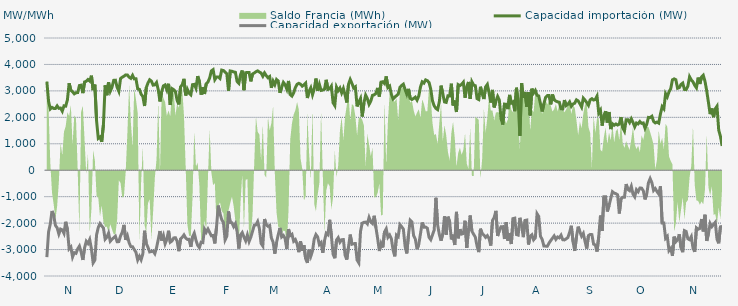
| Category | Capacidad importación (MW) | Capacidad exportación (MW) |
|---|---|---|
| 0 | 3353.167 | -3283.208 |
| 1900-01-01 | 2604.75 | -2336.125 |
| 1900-01-02 | 2316.667 | -2037.25 |
| 1900-01-03 | 2377.083 | -1541.667 |
| 1900-01-04 | 2335.417 | -1708.333 |
| 1900-01-05 | 2333.083 | -2087.5 |
| 1900-01-06 | 2432.958 | -2175.833 |
| 1900-01-07 | 2341.417 | -2411.458 |
| 1900-01-08 | 2350 | -2224.167 |
| 1900-01-09 | 2233.333 | -2255.875 |
| 1900-01-10 | 2436.333 | -2388.333 |
| 1900-01-11 | 2422.917 | -1949.75 |
| 1900-01-12 | 2664.167 | -2243.25 |
| 1900-01-13 | 3289.125 | -2974.875 |
| 1900-01-14 | 3022.042 | -2905.375 |
| 1900-01-15 | 2967.917 | -3281.292 |
| 1900-01-16 | 2888.083 | -3117.75 |
| 1900-01-17 | 2932.458 | -3142.792 |
| 1900-01-18 | 2934.917 | -2973.208 |
| 1900-01-19 | 3202.583 | -2869.458 |
| 1900-01-20 | 3215.75 | -3094.417 |
| 1900-01-21 | 2915.5 | -3393.375 |
| 1900-01-22 | 3338.625 | -2938.583 |
| 1900-01-23 | 3362.542 | -2687.333 |
| 1900-01-24 | 3428.958 | -2770.5 |
| 1900-01-25 | 3372 | -2622.5 |
| 1900-01-26 | 3574.375 | -2972.542 |
| 1900-01-27 | 3028.917 | -3504.875 |
| 1900-01-28 | 3239.167 | -3400.917 |
| 1900-01-29 | 1878.75 | -2447.25 |
| 1900-01-30 | 1204.167 | -2164.583 |
| 1900-01-31 | 1258.333 | -2018.75 |
| 1900-02-01 | 1077.083 | -2108.333 |
| 1900-02-02 | 1711.917 | -2183.333 |
| 1900-02-03 | 3210.167 | -2609.5 |
| 1900-02-04 | 2835.417 | -2533.333 |
| 1900-02-05 | 3323.833 | -2378.417 |
| 1900-02-06 | 2986.708 | -2684.958 |
| 1900-02-07 | 3136.75 | -2609.25 |
| 1900-02-08 | 3398.958 | -2552.333 |
| 1900-02-09 | 3404.708 | -2496.458 |
| 1900-02-10 | 3136.792 | -2703.625 |
| 1900-02-11 | 2984.417 | -2700 |
| 1900-02-12 | 3466.5 | -2483.792 |
| 1900-02-13 | 3518.5 | -2345.833 |
| 1900-02-14 | 3555.167 | -2067 |
| 1900-02-15 | 3605.208 | -2635.583 |
| 1900-02-16 | 3603.083 | -2480.625 |
| 1900-02-17 | 3517.167 | -2743.458 |
| 1900-02-18 | 3473.958 | -2890.375 |
| 1900-02-19 | 3587.875 | -2893.625 |
| 1900-02-20 | 3454.583 | -3000.667 |
| 1900-02-21 | 3456.875 | -3104.042 |
| 1900-02-22 | 3080.708 | -3395.083 |
| 1900-02-23 | 3059.792 | -3254.417 |
| 1900-02-24 | 2872.417 | -3385.667 |
| 1900-02-25 | 2791.792 | -3162.083 |
| 1900-02-26 | 2427.708 | -2287.5 |
| 1900-02-27 | 3123.125 | -2773 |
| 1900-02-28 | 3298.917 | -2914.542 |
| 1900-02-28 | 3420.292 | -3090.167 |
| 1900-03-01 | 3370.083 | -3074.542 |
| 1900-03-02 | 3217.542 | -3055.958 |
| 1900-03-03 | 3229.292 | -3154.333 |
| 1900-03-04 | 3317 | -2928.75 |
| 1900-03-05 | 3040.5 | -2617.875 |
| 1900-03-06 | 2600 | -2300 |
| 1900-03-07 | 2973.125 | -2658.375 |
| 1900-03-08 | 3188.5 | -2468 |
| 1900-03-09 | 3225.417 | -2780.667 |
| 1900-03-10 | 3042.292 | -2615.25 |
| 1900-03-11 | 3269.292 | -2289.5 |
| 1900-03-12 | 2466.917 | -2722.042 |
| 1900-03-13 | 3087.042 | -2676.583 |
| 1900-03-14 | 3046.125 | -2559.917 |
| 1900-03-15 | 2981.833 | -2552.167 |
| 1900-03-16 | 2640.875 | -2681.583 |
| 1900-03-17 | 2488.417 | -3061.75 |
| 1900-03-18 | 3148 | -2596.625 |
| 1900-03-19 | 3235.333 | -2534.25 |
| 1900-03-20 | 3454.833 | -2446.292 |
| 1900-03-21 | 2826.208 | -2562.5 |
| 1900-03-22 | 3055.625 | -2616 |
| 1900-03-23 | 2910.667 | -2614.333 |
| 1900-03-24 | 2851.625 | -2898.833 |
| 1900-03-25 | 3236.792 | -2519.125 |
| 1900-03-26 | 3247.417 | -2381.958 |
| 1900-03-27 | 3102.208 | -2645.667 |
| 1900-03-28 | 3559.042 | -2840.083 |
| 1900-03-29 | 3354.708 | -2929.5 |
| 1900-03-30 | 2857.208 | -2721.292 |
| 1900-03-31 | 3142.708 | -2736.667 |
| 1900-04-01 | 2882.458 | -2227.083 |
| 1900-04-02 | 3271.833 | -2344.333 |
| 1900-04-03 | 3337.5 | -2224.542 |
| 1900-04-04 | 3489.625 | -2354.917 |
| 1900-04-05 | 3757.5 | -2480.083 |
| 1900-04-06 | 3803.5 | -2467.75 |
| 1900-04-07 | 3425.167 | -2769.083 |
| 1900-04-08 | 3524.417 | -2147.917 |
| 1900-04-09 | 3527.917 | -1337.5 |
| 1900-04-10 | 3470.417 | -1637.5 |
| 1900-04-11 | 3786.25 | -1866.667 |
| 1900-04-12 | 3770.917 | -1970.833 |
| 1900-04-13 | 3709.083 | -2634.458 |
| 1900-04-14 | 3643.708 | -2500.125 |
| 1900-04-15 | 3002.833 | -1558.333 |
| 1900-04-16 | 3753.5 | -1977.083 |
| 1900-04-17 | 3742 | -1987.792 |
| 1900-04-18 | 3717 | -2132.708 |
| 1900-04-19 | 3703.5 | -2019.625 |
| 1900-04-20 | 3356.5 | -2318.75 |
| 1900-04-21 | 3287.25 | -2961.542 |
| 1900-04-22 | 3613 | -2448.25 |
| 1900-04-23 | 3770.917 | -2358.208 |
| 1900-04-24 | 3026.833 | -2529 |
| 1900-04-25 | 3690.125 | -2672.167 |
| 1900-04-26 | 3691.917 | -2447.375 |
| 1900-04-27 | 3691.917 | -2696.25 |
| 1900-04-28 | 3359.625 | -2533.208 |
| 1900-04-29 | 3638.208 | -2312.042 |
| 1900-04-30 | 3676.542 | -2081.625 |
| 1900-05-01 | 3724.917 | -2066.75 |
| 1900-05-02 | 3757.5 | -1941.667 |
| 1900-05-03 | 3711.333 | -2204.125 |
| 1900-05-04 | 3675.458 | -2771.042 |
| 1900-05-05 | 3554.458 | -2867.542 |
| 1900-05-06 | 3680.333 | -1844.583 |
| 1900-05-07 | 3578.458 | -2062.333 |
| 1900-05-08 | 3498.667 | -2120.125 |
| 1900-05-09 | 3542.583 | -2088.25 |
| 1900-05-10 | 3116.583 | -2558.083 |
| 1900-05-11 | 3368.333 | -2721.125 |
| 1900-05-12 | 3235.167 | -3154.375 |
| 1900-05-13 | 3431.792 | -2737.167 |
| 1900-05-14 | 3373.458 | -2436.25 |
| 1900-05-15 | 2927.625 | -2181.583 |
| 1900-05-16 | 3136.625 | -2524.417 |
| 1900-05-17 | 3321.958 | -2467.708 |
| 1900-05-18 | 3237.167 | -2582.667 |
| 1900-05-19 | 3067.667 | -2979.292 |
| 1900-05-20 | 3375.875 | -2228.75 |
| 1900-05-21 | 2860.583 | -2468.833 |
| 1900-05-22 | 2803.375 | -2421.417 |
| 1900-05-23 | 2924.833 | -2685.667 |
| 1900-05-24 | 3128.125 | -2622.333 |
| 1900-05-25 | 3249.042 | -2786 |
| 1900-05-26 | 3285.957 | -3098.435 |
| 1900-05-27 | 3251.125 | -2683.875 |
| 1900-05-28 | 3179.958 | -3042.333 |
| 1900-05-29 | 3227.792 | -2833.458 |
| 1900-05-30 | 3292.833 | -3348.958 |
| 1900-05-31 | 2730.667 | -3504.917 |
| 1900-06-01 | 2985 | -3005.417 |
| 1900-06-02 | 3117.458 | -3250.417 |
| 1900-06-03 | 2855.083 | -3052.042 |
| 1900-06-04 | 3069.458 | -2602.292 |
| 1900-06-05 | 3466.417 | -2432.792 |
| 1900-06-06 | 3007.167 | -2522.875 |
| 1900-06-07 | 3244.375 | -2811.167 |
| 1900-06-08 | 3017.708 | -2737.208 |
| 1900-06-09 | 3032.833 | -3121.625 |
| 1900-06-10 | 3065.708 | -2665.083 |
| 1900-06-11 | 3418.292 | -2382.667 |
| 1900-06-12 | 3056.792 | -2438.792 |
| 1900-06-13 | 3079.167 | -1874.583 |
| 1900-06-14 | 3179.375 | -2471.917 |
| 1900-06-15 | 2552.25 | -3173.583 |
| 1900-06-16 | 2444.667 | -3327.792 |
| 1900-06-17 | 3144.958 | -2640.625 |
| 1900-06-18 | 3010.208 | -2550.208 |
| 1900-06-19 | 3107.125 | -2722.583 |
| 1900-06-20 | 2923.625 | -2627.417 |
| 1900-06-21 | 3090.583 | -2621.917 |
| 1900-06-22 | 2846.083 | -3210.25 |
| 1900-06-23 | 2560.75 | -3379.792 |
| 1900-06-24 | 3251.25 | -2896.042 |
| 1900-06-25 | 3432.333 | -2434.75 |
| 1900-06-26 | 3283.375 | -2799.542 |
| 1900-06-27 | 3108.792 | -2777.042 |
| 1900-06-28 | 3154.917 | -2772.25 |
| 1900-06-29 | 2413.25 | -3395.792 |
| 1900-06-30 | 2576 | -3503 |
| 1900-07-01 | 2711.917 | -2310.333 |
| 1900-07-02 | 2031.25 | -2002.083 |
| 1900-07-03 | 2544.667 | -1970.833 |
| 1900-07-04 | 2838.208 | -1962.5 |
| 1900-07-05 | 2706.708 | -2031.25 |
| 1900-07-06 | 2490.375 | -1785.417 |
| 1900-07-07 | 2612.792 | -1947.333 |
| 1900-07-08 | 2833 | -2014.333 |
| 1900-07-09 | 2851.583 | -1722.917 |
| 1900-07-10 | 2901.75 | -2171.25 |
| 1900-07-11 | 3113.667 | -2582.042 |
| 1900-07-12 | 2787.083 | -3055.958 |
| 1900-07-13 | 3331.625 | -2767.125 |
| 1900-07-14 | 3347 | -2920.625 |
| 1900-07-15 | 3277.833 | -2334.375 |
| 1900-07-16 | 3547.333 | -2216.875 |
| 1900-07-17 | 3127.583 | -2536.667 |
| 1900-07-18 | 3182.75 | -2450.958 |
| 1900-07-19 | 2868.792 | -2589.917 |
| 1900-07-20 | 2696.25 | -3016.542 |
| 1900-07-21 | 2758.458 | -3256.458 |
| 1900-07-22 | 2820.083 | -2452.083 |
| 1900-07-23 | 2874.792 | -2511.083 |
| 1900-07-24 | 3131.542 | -2059.125 |
| 1900-07-25 | 3205.375 | -2136.25 |
| 1900-07-26 | 3253.375 | -2224.125 |
| 1900-07-27 | 3057.042 | -2870.958 |
| 1900-07-28 | 2876.042 | -3146.333 |
| 1900-07-29 | 3076.708 | -2437.5 |
| 1900-07-30 | 2714.417 | -1890.667 |
| 1900-07-31 | 2675.25 | -1952.042 |
| 1900-08-01 | 2712.625 | -2473.333 |
| 1900-08-02 | 2762.542 | -2608.917 |
| 1900-08-03 | 2652 | -2984.583 |
| 1900-08-04 | 2806.792 | -2803.333 |
| 1900-08-05 | 3151.167 | -2401.458 |
| 1900-08-06 | 3341.792 | -1976.417 |
| 1900-08-07 | 3295.083 | -2154.25 |
| 1900-08-08 | 3415.542 | -2148.458 |
| 1900-08-09 | 3386.458 | -2191.625 |
| 1900-08-10 | 3315.833 | -2538.333 |
| 1900-08-11 | 3059.75 | -2627.417 |
| 1900-08-12 | 2619.042 | -2445.958 |
| 1900-08-13 | 2434.542 | -2258.708 |
| 1900-08-14 | 2336.958 | -1043.75 |
| 1900-08-15 | 2291.5 | -2066.667 |
| 1900-08-16 | 2591.375 | -2432.417 |
| 1900-08-17 | 3198.167 | -2666.208 |
| 1900-08-18 | 2894.833 | -2404.875 |
| 1900-08-19 | 2582.208 | -1743.542 |
| 1900-08-20 | 2566.333 | -2434.875 |
| 1900-08-21 | 2811.458 | -1757.708 |
| 1900-08-22 | 2808 | -1938.167 |
| 1900-08-23 | 3272.083 | -2618.542 |
| 1900-08-24 | 2447.208 | -2437.333 |
| 1900-08-25 | 2633.208 | -2826.667 |
| 1900-08-26 | 2202.083 | -1575 |
| 1900-08-27 | 3237.583 | -2574.625 |
| 1900-08-28 | 3201.042 | -2230.542 |
| 1900-08-29 | 3248.625 | -2416.417 |
| 1900-08-30 | 3327.583 | -2395.083 |
| 1900-08-31 | 2740.958 | -1910.417 |
| 1900-09-01 | 3160.083 | -2937.917 |
| 1900-09-02 | 3339 | -2237.833 |
| 1900-09-03 | 2697.208 | -1712.5 |
| 1900-09-04 | 3342.917 | -2305.083 |
| 1900-09-05 | 3218 | -2421.583 |
| 1900-09-06 | 3194.333 | -2530.333 |
| 1900-09-07 | 2706.458 | -2869.083 |
| 1900-09-08 | 2673 | -3096.5 |
| 1900-09-09 | 3156.5 | -2212.083 |
| 1900-09-10 | 2884.958 | -2401.708 |
| 1900-09-11 | 2692.292 | -2450.833 |
| 1900-09-12 | 3152.125 | -2539.5 |
| 1900-09-13 | 3244.042 | -2473.208 |
| 1900-09-14 | 2930.458 | -2581.292 |
| 1900-09-15 | 2559.833 | -2848.708 |
| 1900-09-16 | 3037.583 | -1901.417 |
| 1900-09-17 | 2375 | -1787.5 |
| 1900-09-18 | 2608.75 | -1537.5 |
| 1900-09-19 | 2790.667 | -2487.458 |
| 1900-09-20 | 2656.542 | -2277.167 |
| 1900-09-21 | 1950.833 | -2138.208 |
| 1900-09-22 | 1725 | -2133.333 |
| 1900-09-23 | 2500 | -2600 |
| 1900-09-24 | 2493.5 | -1964.583 |
| 1900-09-25 | 2311.125 | -2662.542 |
| 1900-09-26 | 2848.5 | -2386.333 |
| 1900-09-27 | 2541.5 | -2790.625 |
| 1900-09-28 | 2586.083 | -1829.542 |
| 1900-09-29 | 2229.167 | -1813.75 |
| 1900-09-30 | 3118.458 | -2430.875 |
| 1900-10-01 | 2560.5 | -2453.333 |
| 1900-10-02 | 1300 | -1800 |
| 1900-10-03 | 3293.208 | -2107.333 |
| 1900-10-04 | 2732.333 | -2531.667 |
| 1900-10-05 | 2958.208 | -1899.667 |
| 1900-10-06 | 2400 | -1885.417 |
| 1900-10-07 | 2949.792 | -2809.042 |
| 1900-10-08 | 2072.292 | -2500 |
| 1900-10-09 | 3083.958 | -2440.167 |
| 1900-10-10 | 2921.208 | -2632.667 |
| 1900-10-11 | 3017.667 | -2556.542 |
| 1900-10-12 | 2833.833 | -1646.083 |
| 1900-10-13 | 2807.833 | -1750 |
| 1900-10-14 | 2510.417 | -2496.792 |
| 1900-10-15 | 2220.833 | -2618.625 |
| 1900-10-16 | 2512.5 | -2867.042 |
| 1900-10-17 | 2756.375 | -2870.75 |
| 1900-10-18 | 2821.542 | -2876.667 |
| 1900-10-19 | 2821.833 | -2755.625 |
| 1900-10-20 | 2490.292 | -2656.833 |
| 1900-10-21 | 2862.667 | -2571.458 |
| 1900-10-22 | 2663.042 | -2482.25 |
| 1900-10-23 | 2613.625 | -2612.792 |
| 1900-10-24 | 2585.667 | -2523.458 |
| 1900-10-25 | 2571.292 | -2556.167 |
| 1900-10-26 | 2320.458 | -2456.542 |
| 1900-10-27 | 2316.542 | -2627.667 |
| 1900-10-28 | 2652.5 | -2635.708 |
| 1900-10-29 | 2442.625 | -2594.208 |
| 1900-10-30 | 2493.458 | -2546.125 |
| 1900-10-31 | 2582.917 | -2351.208 |
| 1900-11-01 | 2416.667 | -2100 |
| 1900-11-02 | 2504.5 | -2703.167 |
| 1900-11-03 | 2536.625 | -3052.25 |
| 1900-11-04 | 2662.208 | -2510.833 |
| 1900-11-05 | 2620.667 | -2134.75 |
| 1900-11-06 | 2511.833 | -2330.583 |
| 1900-11-07 | 2387.333 | -2494.25 |
| 1900-11-08 | 2724.583 | -2389 |
| 1900-11-09 | 2648.667 | -2691.542 |
| 1900-11-10 | 2557.292 | -2961.542 |
| 1900-11-11 | 2454.083 | -2472.25 |
| 1900-11-12 | 2661.417 | -2427.292 |
| 1900-11-13 | 2704.833 | -2434.167 |
| 1900-11-14 | 2653.75 | -2795.833 |
| 1900-11-15 | 2673.75 | -2822.875 |
| 1900-11-16 | 2800.917 | -3075.208 |
| 1900-11-17 | 2164.417 | -2510.625 |
| 1900-11-18 | 2270.833 | -1713.542 |
| 1900-11-19 | 1687.5 | -2291.667 |
| 1900-11-20 | 2066.667 | -1000 |
| 1900-11-21 | 2233.333 | -1000 |
| 1900-11-22 | 1804.167 | -1561.333 |
| 1900-11-23 | 2201.833 | -1341.667 |
| 1900-11-24 | 1556.25 | -1070.833 |
| 1900-11-25 | 1756.25 | -812.5 |
| 1900-11-26 | 1700 | -864.583 |
| 1900-11-27 | 1750 | -885.417 |
| 1900-11-28 | 1708.333 | -929.167 |
| 1900-11-29 | 1743.75 | -1636.25 |
| 1900-11-30 | 2008.083 | -1077.083 |
| 1900-12-01 | 1602.083 | -1020.833 |
| 1900-12-02 | 1479.167 | -1022.917 |
| 1900-12-03 | 1910.417 | -525 |
| 1900-12-04 | 1912.5 | -727.083 |
| 1900-12-05 | 1804.167 | -775 |
| 1900-12-06 | 1945.833 | -608.333 |
| 1900-12-07 | 1808.333 | -904.167 |
| 1900-12-08 | 1641.667 | -1006.25 |
| 1900-12-09 | 1785.417 | -735.417 |
| 1900-12-10 | 1752.083 | -812.5 |
| 1900-12-11 | 1841.667 | -675 |
| 1900-12-12 | 1772.917 | -677.083 |
| 1900-12-13 | 1788 | -777.083 |
| 1900-12-14 | 1587.5 | -1104.167 |
| 1900-12-15 | 1737.5 | -900 |
| 1900-12-16 | 1997.917 | -475 |
| 1900-12-17 | 1995.833 | -316.667 |
| 1900-12-18 | 2041.667 | -468.75 |
| 1900-12-19 | 1843.75 | -766.667 |
| 1900-12-20 | 1787.5 | -695.833 |
| 1900-12-21 | 1820.833 | -808.333 |
| 1900-12-22 | 1781.25 | -900 |
| 1900-12-23 | 2126.667 | -608.333 |
| 1900-12-24 | 2404.417 | -2000 |
| 1900-12-25 | 2323.167 | -2000 |
| 1900-12-26 | 2893.583 | -2571.5 |
| 1900-12-27 | 2778.083 | -2500.25 |
| 1900-12-28 | 2965.5 | -3038.667 |
| 1900-12-29 | 3083.64 | -2955.48 |
| 1900-12-30 | 3418.208 | -3238.958 |
| 1900-12-31 | 3452.875 | -2513.333 |
| 1901-01-01 | 3420.292 | -2703.208 |
| 1901-01-02 | 3100.083 | -2630.333 |
| 1901-01-03 | 3123.375 | -2422.458 |
| 1901-01-04 | 3242.792 | -2928.833 |
| 1901-01-05 | 3294.958 | -3098.417 |
| 1901-01-06 | 3054.042 | -2285.333 |
| 1901-01-07 | 3047.542 | -2315.25 |
| 1901-01-08 | 3179.458 | -2592.333 |
| 1901-01-09 | 3533.833 | -2627.792 |
| 1901-01-10 | 3414 | -2509.75 |
| 1901-01-11 | 3340.25 | -2944.208 |
| 1901-01-12 | 3208.208 | -3084.875 |
| 1901-01-13 | 3116.333 | -2180.292 |
| 1901-01-14 | 3502.875 | -2231.333 |
| 1901-01-15 | 3262.542 | -2201.667 |
| 1901-01-16 | 3524.167 | -1845.708 |
| 1901-01-17 | 3589.042 | -2314 |
| 1901-01-18 | 3358.375 | -1684.042 |
| 1901-01-19 | 3002 | -2672.375 |
| 1901-01-20 | 2567.583 | -2409.375 |
| 1901-01-21 | 2121 | -2013.417 |
| 1901-01-22 | 2334.5 | -2132.333 |
| 1901-01-23 | 2006.833 | -2047.042 |
| 1901-01-24 | 2325 | -1968.542 |
| 1901-01-25 | 2420.75 | -2611.292 |
| 1901-01-26 | 1517.25 | -2763 |
| 1901-01-27 | 1283.917 | -2141.667 |
| 1901-01-28 | 916.417 | -2120.833 |